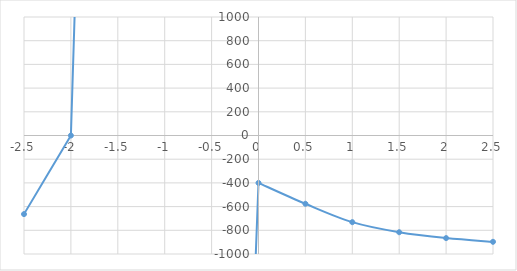
| Category | Series 0 |
|---|---|
| -2.5 | -663.37 |
| -2.0 | 0 |
| -1.5 | 12800 |
| -1.0 | 1000000000 |
| -0.5 | -10800 |
| 0.0 | -400 |
| 0.5 | -576.132 |
| 1.0 | -731.25 |
| 1.5 | -816.256 |
| 2.0 | -865.844 |
| 2.5 | -897.055 |